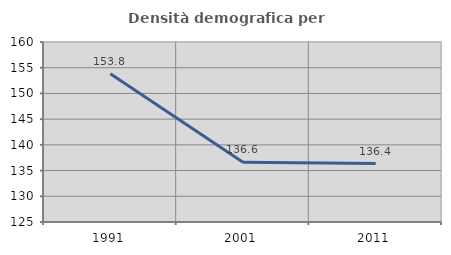
| Category | Densità demografica |
|---|---|
| 1991.0 | 153.843 |
| 2001.0 | 136.617 |
| 2011.0 | 136.369 |